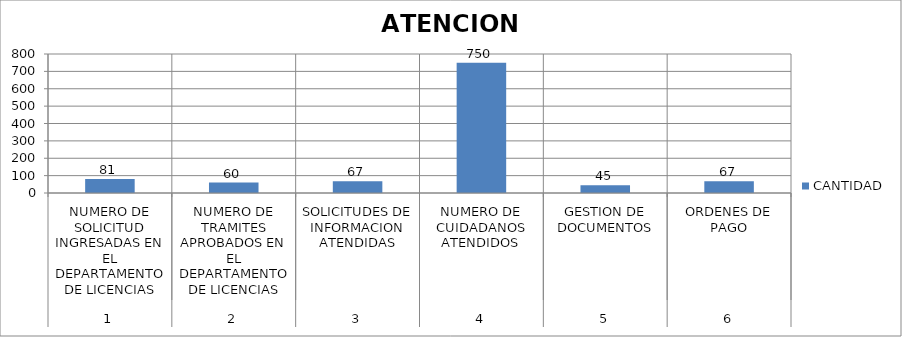
| Category | CANTIDAD |
|---|---|
| 0 | 81 |
| 1 | 60 |
| 2 | 67 |
| 3 | 750 |
| 4 | 45 |
| 5 | 67 |